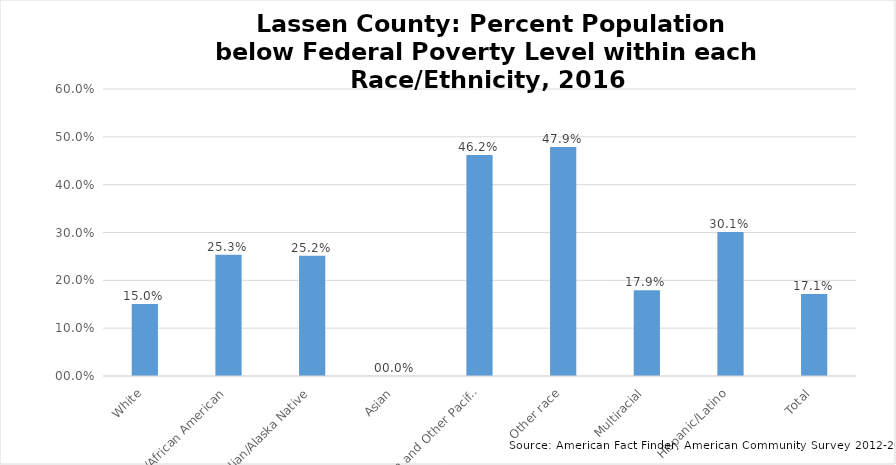
| Category | Percent Population below Poverty Level in  Lassen County |
|---|---|
| White | 0.15 |
| Black/African American | 0.253 |
| American Indian/Alaska Native | 0.252 |
| Asian | 0 |
|  Native Hawaiian and Other Pacific Islander | 0.462 |
| Other race | 0.479 |
| Multiracial | 0.179 |
| Hispanic/Latino | 0.301 |
| Total | 0.171 |